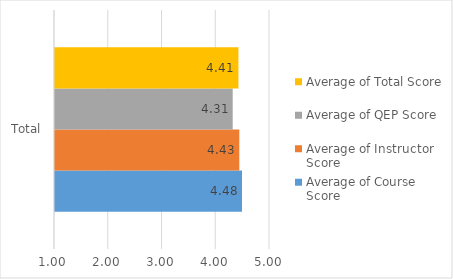
| Category | Average of Course Score | Average of Instructor Score | Average of QEP Score | Average of Total Score |
|---|---|---|---|---|
| Total | 4.479 | 4.429 | 4.306 | 4.412 |